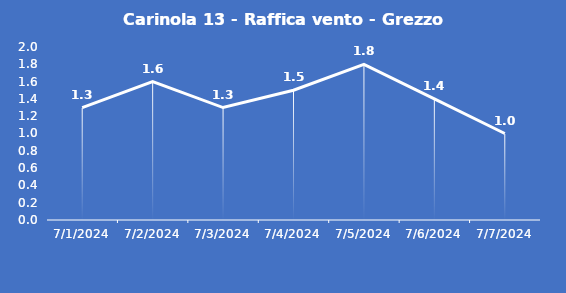
| Category | Carinola 13 - Raffica vento - Grezzo (m/s) |
|---|---|
| 7/1/24 | 1.3 |
| 7/2/24 | 1.6 |
| 7/3/24 | 1.3 |
| 7/4/24 | 1.5 |
| 7/5/24 | 1.8 |
| 7/6/24 | 1.4 |
| 7/7/24 | 1 |